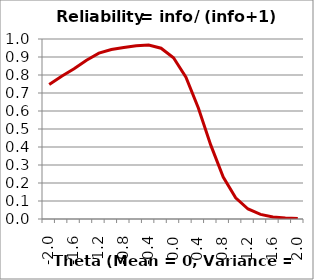
| Category | Reliability |
|---|---|
| -2.0 | 0.747 |
| -1.8 | 0.794 |
| -1.6 | 0.835 |
| -1.4 | 0.882 |
| -1.2 | 0.921 |
| -1.0 | 0.942 |
| -0.8 | 0.952 |
| -0.6 | 0.963 |
| -0.4 | 0.967 |
| -0.2 | 0.949 |
| 0.0 | 0.896 |
| 0.2 | 0.788 |
| 0.4 | 0.616 |
| 0.6 | 0.41 |
| 0.8 | 0.233 |
| 1.0 | 0.117 |
| 1.2 | 0.056 |
| 1.4 | 0.026 |
| 1.6 | 0.012 |
| 1.8 | 0.005 |
| 2.0 | 0.002 |